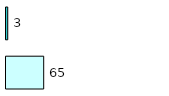
| Category | Series 0 | Series 1 |
|---|---|---|
| 0 | 65 | 3 |